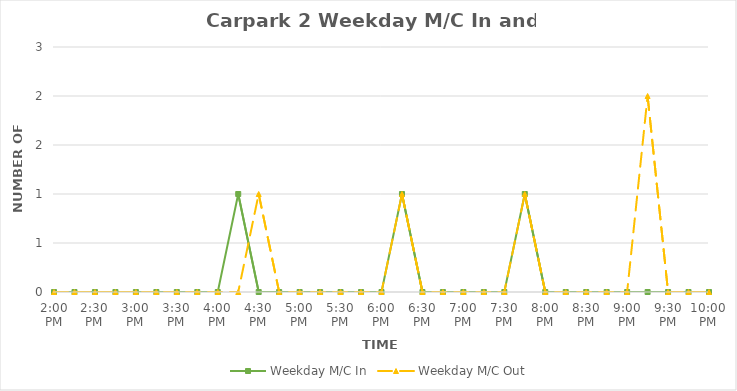
| Category | Weekday M/C In | Weekday M/C Out |
|---|---|---|
| 0.5833333333333334 | 0 | 0 |
| 0.59375 | 0 | 0 |
| 0.604166666666667 | 0 | 0 |
| 0.614583333333334 | 0 | 0 |
| 0.625 | 0 | 0 |
| 0.635416666666667 | 0 | 0 |
| 0.645833333333334 | 0 | 0 |
| 0.656250000000001 | 0 | 0 |
| 0.666666666666667 | 0 | 0 |
| 0.677083333333334 | 1 | 0 |
| 0.687500000000001 | 0 | 1 |
| 0.697916666666668 | 0 | 0 |
| 0.708333333333335 | 0 | 0 |
| 0.718750000000002 | 0 | 0 |
| 0.729166666666669 | 0 | 0 |
| 0.739583333333336 | 0 | 0 |
| 0.75 | 0 | 0 |
| 0.7604166666666666 | 1 | 1 |
| 0.7708333333333334 | 0 | 0 |
| 0.78125 | 0 | 0 |
| 0.7916666666666666 | 0 | 0 |
| 0.8020833333333334 | 0 | 0 |
| 0.8125 | 0 | 0 |
| 0.8229166666666666 | 1 | 1 |
| 0.8333333333333334 | 0 | 0 |
| 0.84375 | 0 | 0 |
| 0.8541666666666666 | 0 | 0 |
| 0.8645833333333334 | 0 | 0 |
| 0.875 | 0 | 0 |
| 0.8854166666666666 | 0 | 2 |
| 0.8958333333333334 | 0 | 0 |
| 0.90625 | 0 | 0 |
| 0.9166666666666666 | 0 | 0 |